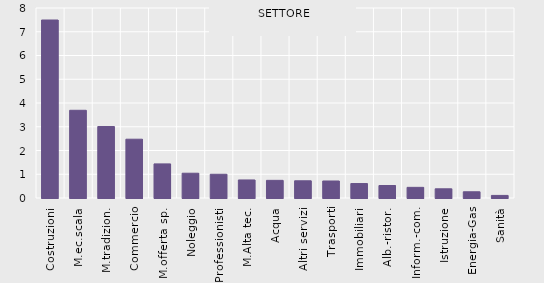
| Category | SETTORI |
|---|---|
| Costruzioni | 7.494 |
| M.ec.scala | 3.693 |
| M.tradizion. | 3.01 |
| Commercio | 2.475 |
| M.offerta sp. | 1.435 |
| Noleggio | 1.043 |
| Professionisti | 1 |
| M.Alta tec. | 0.76 |
| Acqua | 0.743 |
| Altri servizi | 0.725 |
| Trasporti | 0.716 |
| Immobiliari | 0.609 |
| Alb.-ristor. | 0.526 |
| Inform.-com. | 0.449 |
| Istruzione | 0.387 |
| Energia-Gas | 0.262 |
| Sanità | 0.109 |